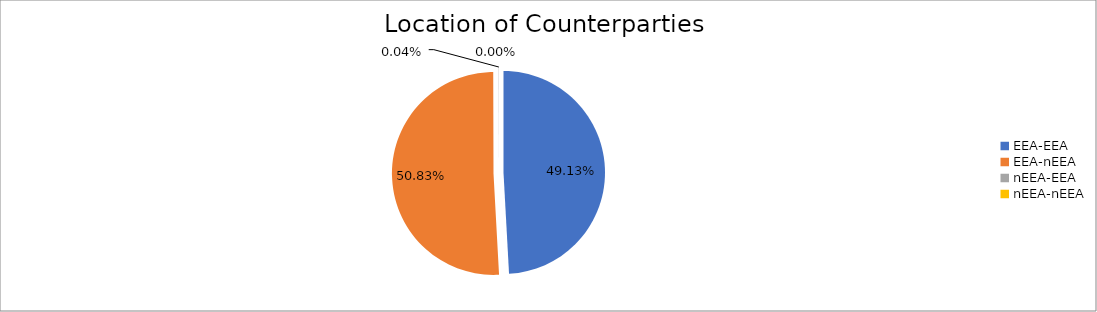
| Category | Series 0 |
|---|---|
| EEA-EEA | 6031932.926 |
| EEA-nEEA | 6240364.335 |
| nEEA-EEA | 4866.064 |
| nEEA-nEEA | 507.191 |